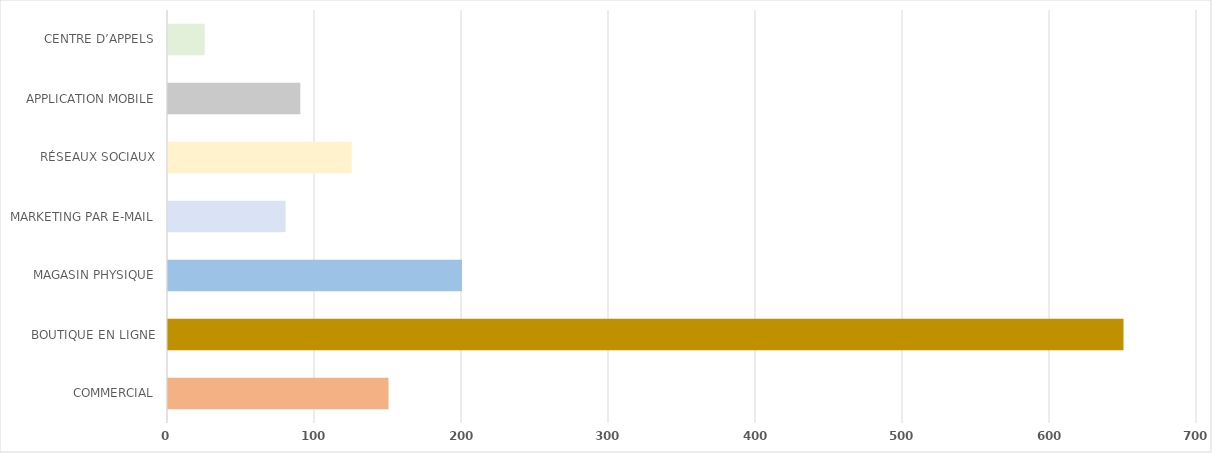
| Category | Series 0 |
|---|---|
| COMMERCIAL | 150 |
| BOUTIQUE EN LIGNE | 650 |
| MAGASIN PHYSIQUE | 200 |
| MARKETING PAR E-MAIL | 80 |
| RÉSEAUX SOCIAUX | 125 |
| APPLICATION MOBILE | 90 |
| CENTRE D’APPELS | 25 |